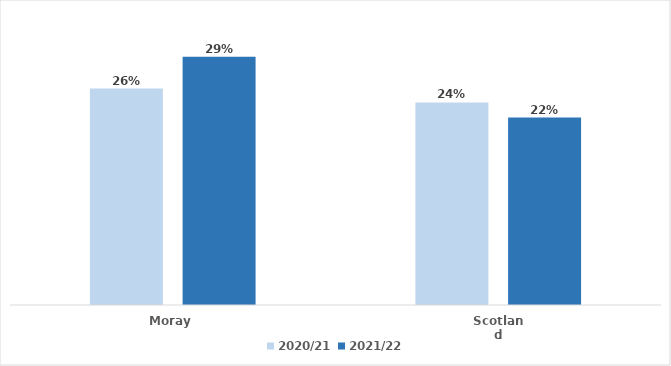
| Category | 2020/21 | 2021/22 |
|---|---|---|
| Moray | 0.257 | 0.294 |
| Scotland | 0.24 | 0.222 |